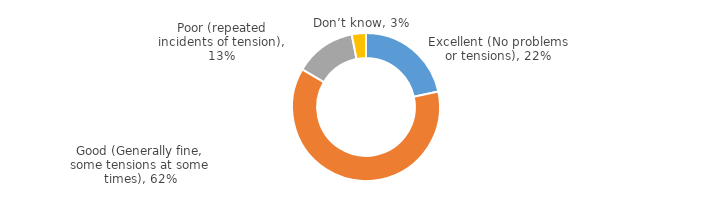
| Category | Series 0 |
|---|---|
| Excellent (No problems or tensions) | 0.216 |
| Good (Generally fine, some tensions at some times) | 0.619 |
| Poor (repeated incidents of tension) | 0.134 |
| Don’t know | 0.031 |